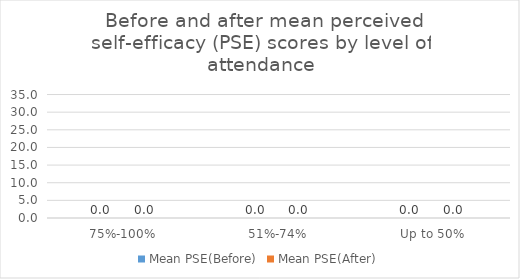
| Category | Mean PSE(Before) | Mean PSE(After) |
|---|---|---|
| 75%-100% | 0 | 0 |
| 51%-74% | 0 | 0 |
| Up to 50% | 0 | 0 |